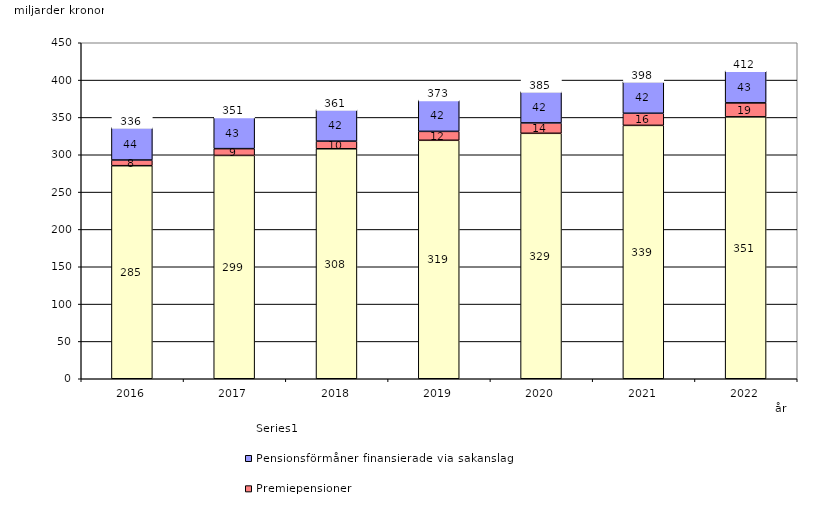
| Category | Inkomstpension och tilläggspension m.m. | Premiepensioner | Pensionsförmåner finansierade via sakanslag | Series 0 |
|---|---|---|---|---|
| 2016.0 | 285.357 | 7.598 | 43.541 | 20 |
| 2017.0 | 299.103 | 9.081 | 42.508 | 20 |
| 2018.0 | 308.029 | 10.233 | 42.437 | 20 |
| 2019.0 | 319.372 | 11.945 | 41.937 | 20 |
| 2020.0 | 328.728 | 13.919 | 41.982 | 20 |
| 2021.0 | 339.345 | 16.231 | 42.366 | 20 |
| 2022.0 | 350.77 | 18.711 | 42.933 | 20 |